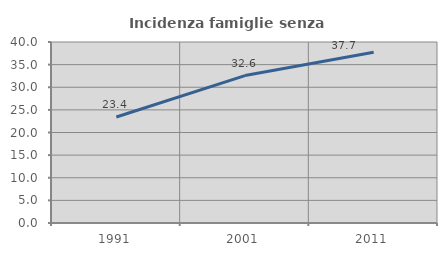
| Category | Incidenza famiglie senza nuclei |
|---|---|
| 1991.0 | 23.415 |
| 2001.0 | 32.579 |
| 2011.0 | 37.745 |